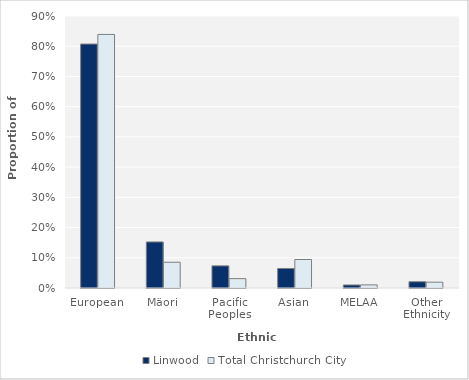
| Category | Linwood | Total Christchurch City |
|---|---|---|
| European | 0.807 | 0.839 |
| Mäori | 0.152 | 0.085 |
| Pacific Peoples | 0.073 | 0.031 |
| Asian | 0.065 | 0.094 |
| MELAA | 0.01 | 0.01 |
| Other Ethnicity | 0.021 | 0.019 |